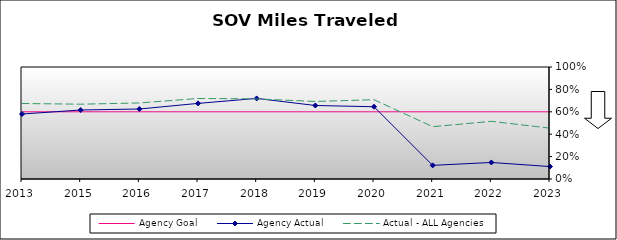
| Category | Agency Goal | Agency Actual | Actual - ALL Agencies |
|---|---|---|---|
| 2013.0 | 0.6 | 0.58 | 0.674 |
| 2015.0 | 0.6 | 0.616 | 0.668 |
| 2016.0 | 0.6 | 0.625 | 0.679 |
| 2017.0 | 0.6 | 0.675 | 0.719 |
| 2018.0 | 0.6 | 0.719 | 0.715 |
| 2019.0 | 0.6 | 0.656 | 0.692 |
| 2020.0 | 0.6 | 0.645 | 0.708 |
| 2021.0 | 0.6 | 0.122 | 0.467 |
| 2022.0 | 0.6 | 0.148 | 0.515 |
| 2023.0 | 0.6 | 0.111 | 0.454 |